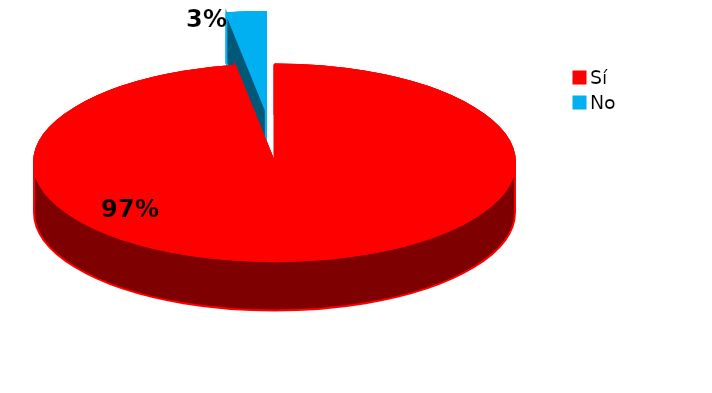
| Category | Series 0 |
|---|---|
| Sí | 260 |
| No | 7 |